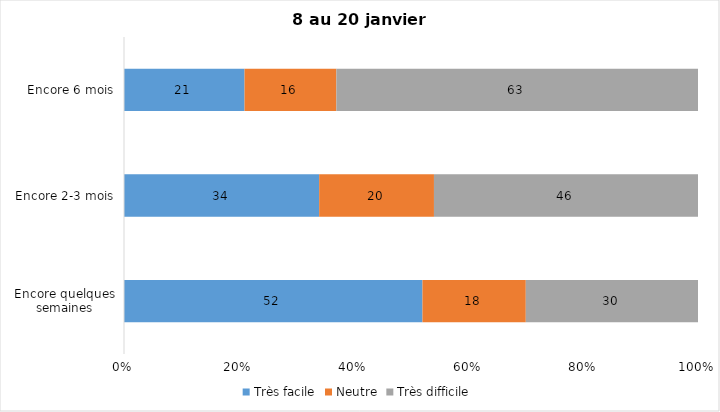
| Category | Très facile | Neutre | Très difficile |
|---|---|---|---|
| Encore quelques semaines | 52 | 18 | 30 |
| Encore 2-3 mois | 34 | 20 | 46 |
| Encore 6 mois | 21 | 16 | 63 |